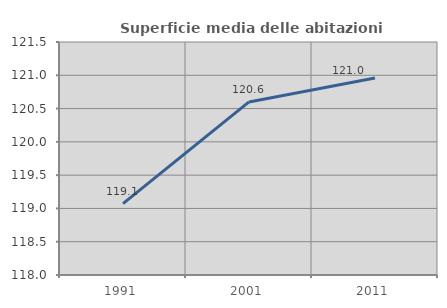
| Category | Superficie media delle abitazioni occupate |
|---|---|
| 1991.0 | 119.072 |
| 2001.0 | 120.6 |
| 2011.0 | 120.958 |